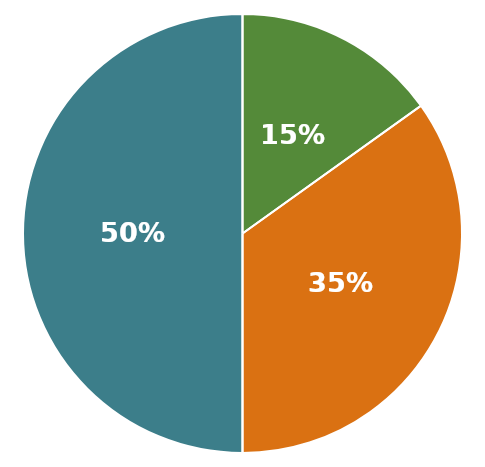
| Category | Total Aset |
|---|---|
| 0 | 1902500 |
| 1 | 575000 |
| 2 | 1327500 |